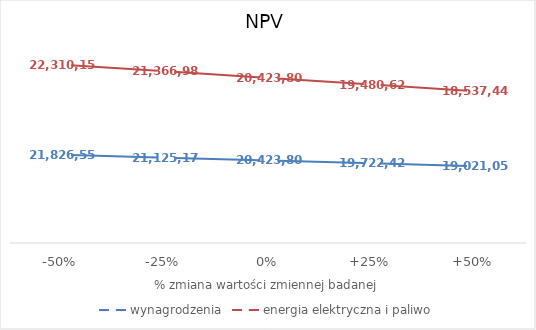
| Category | wynagrodzenia | energia elektryczna i paliwo |
|---|---|---|
| -50% | 21826550.023 | 22310159.137 |
| -25% | 21125175.562 | 21366980.119 |
| 0% | 20423801.102 | 20423801.102 |
| +25% | 19722426.642 | 19480622.085 |
| +50% | 19021052.182 | 18537443.068 |